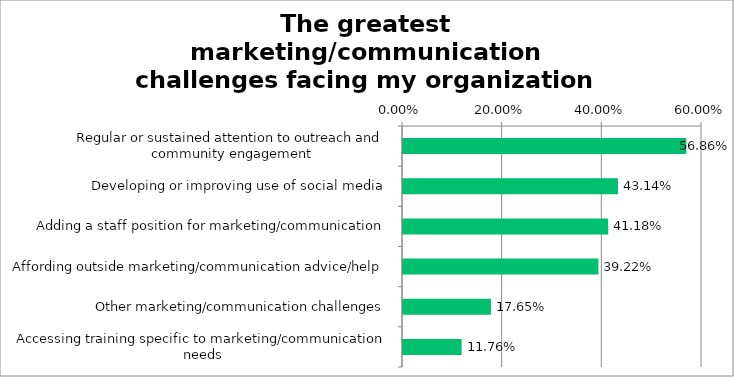
| Category | Responses |
|---|---|
| Regular or sustained attention to outreach and community engagement | 0.569 |
| Developing or improving use of social media | 0.431 |
| Adding a staff position for marketing/communication | 0.412 |
| Affording outside marketing/communication advice/help | 0.392 |
| Other marketing/communication challenges | 0.176 |
| Accessing training specific to marketing/communication needs | 0.118 |